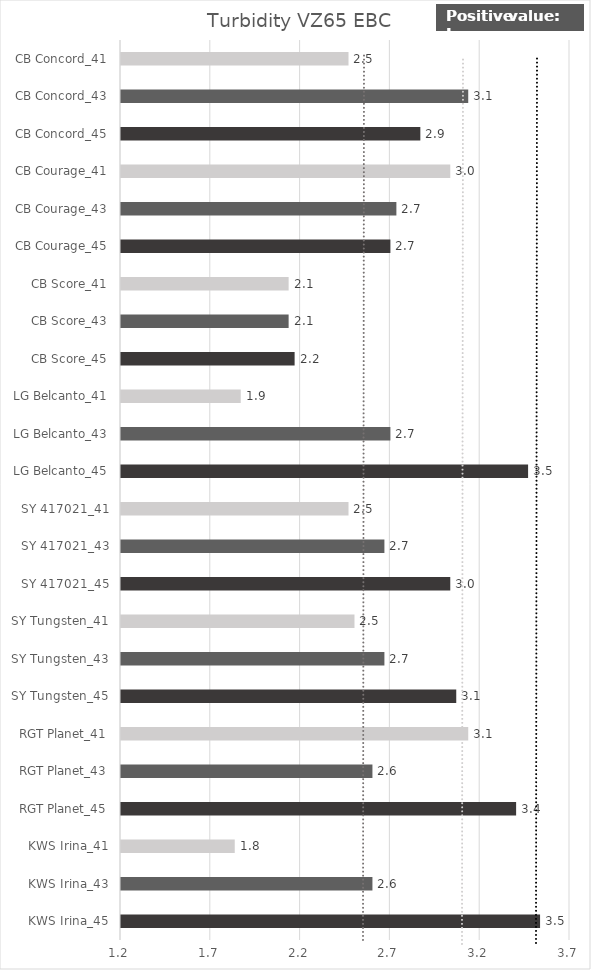
| Category |   Turbidity VZ65 EBC |
|---|---|
| KWS Irina_45 | 3.533 |
| KWS Irina_43 | 2.6 |
| KWS Irina_41 | 1.833 |
| RGT Planet_45 | 3.4 |
| RGT Planet_43 | 2.6 |
| RGT Planet_41 | 3.133 |
| SY Tungsten_45 | 3.067 |
| SY Tungsten_43 | 2.667 |
| SY Tungsten_41 | 2.5 |
| SY 417021_45 | 3.033 |
| SY 417021_43 | 2.667 |
| SY 417021_41 | 2.467 |
| LG Belcanto_45 | 3.467 |
| LG Belcanto_43 | 2.7 |
| LG Belcanto_41 | 1.867 |
| CB Score_45 | 2.167 |
| CB Score_43 | 2.133 |
| CB Score_41 | 2.133 |
| CB Courage_45 | 2.7 |
| CB Courage_43 | 2.733 |
| CB Courage_41 | 3.033 |
| CB Concord_45 | 2.867 |
| CB Concord_43 | 3.133 |
| CB Concord_41 | 2.467 |